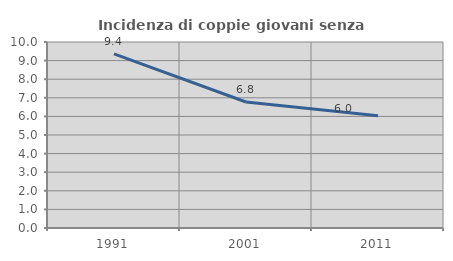
| Category | Incidenza di coppie giovani senza figli |
|---|---|
| 1991.0 | 9.361 |
| 2001.0 | 6.775 |
| 2011.0 | 6.032 |